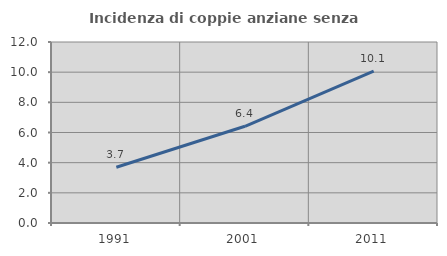
| Category | Incidenza di coppie anziane senza figli  |
|---|---|
| 1991.0 | 3.696 |
| 2001.0 | 6.412 |
| 2011.0 | 10.076 |